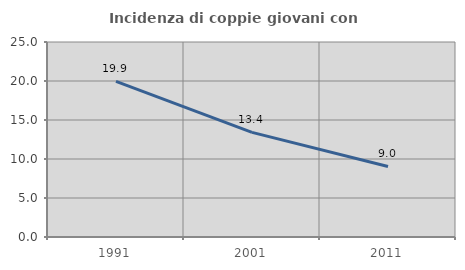
| Category | Incidenza di coppie giovani con figli |
|---|---|
| 1991.0 | 19.941 |
| 2001.0 | 13.414 |
| 2011.0 | 9.041 |